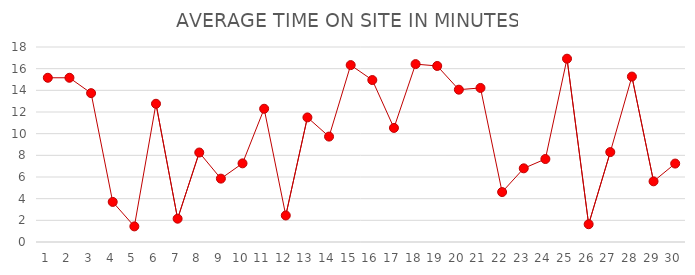
| Category | AVERAGE TIME ON SITE IN MINUTES |
|---|---|
| 1.0 | 15.16 |
| 2.0 | 15.16 |
| 3.0 | 13.74 |
| 4.0 | 3.7 |
| 5.0 | 1.44 |
| 6.0 | 12.76 |
| 7.0 | 2.15 |
| 8.0 | 8.26 |
| 9.0 | 5.85 |
| 10.0 | 7.26 |
| 11.0 | 12.3 |
| 12.0 | 2.45 |
| 13.0 | 11.5 |
| 14.0 | 9.73 |
| 15.0 | 16.33 |
| 16.0 | 14.95 |
| 17.0 | 10.53 |
| 18.0 | 16.42 |
| 19.0 | 16.25 |
| 20.0 | 14.06 |
| 21.0 | 14.22 |
| 22.0 | 4.61 |
| 23.0 | 6.8 |
| 24.0 | 7.66 |
| 25.0 | 16.92 |
| 26.0 | 1.64 |
| 27.0 | 8.3 |
| 28.0 | 15.27 |
| 29.0 | 5.6 |
| 30.0 | 7.24 |